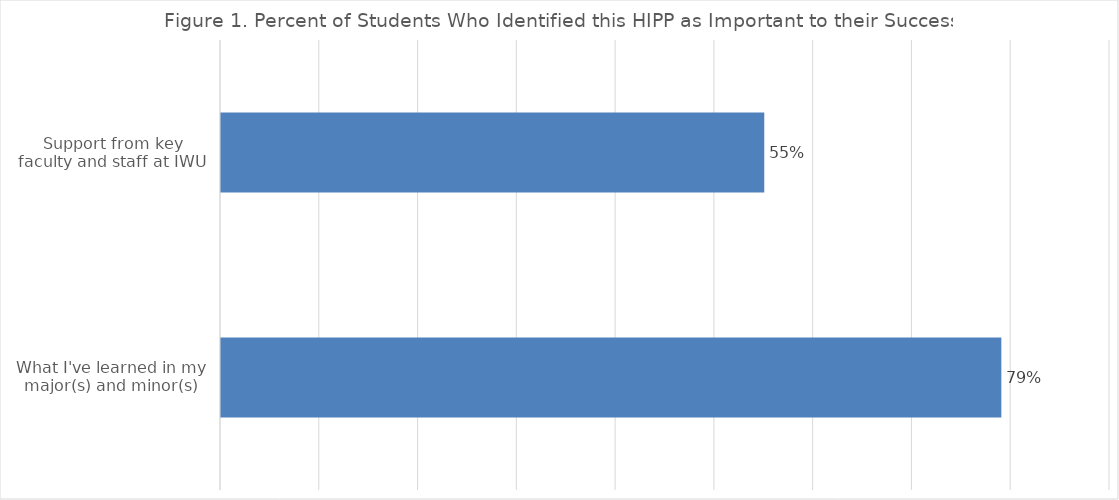
| Category | % Selected |
|---|---|
| What I've learned in my major(s) and minor(s) | 0.79 |
| Support from key faculty and staff at IWU | 0.55 |